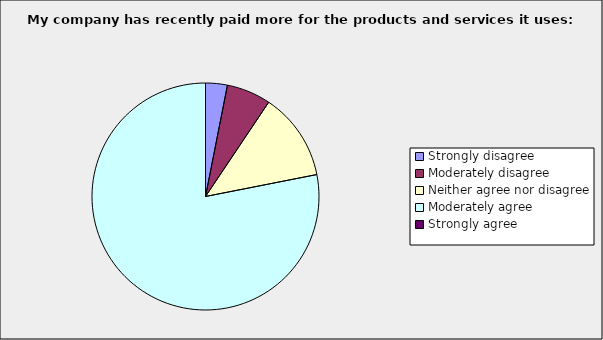
| Category | Series 0 |
|---|---|
| Strongly disagree | 0.031 |
| Moderately disagree | 0.063 |
| Neither agree nor disagree | 0.125 |
| Moderately agree | 0.781 |
| Strongly agree | 0 |